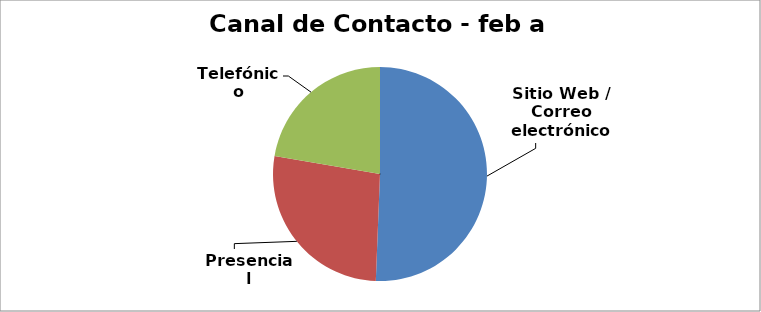
| Category | Series 0 |
|---|---|
| Sitio Web / Correo electrónico | 243 |
| Presencial | 130 |
| Telefónico | 107 |